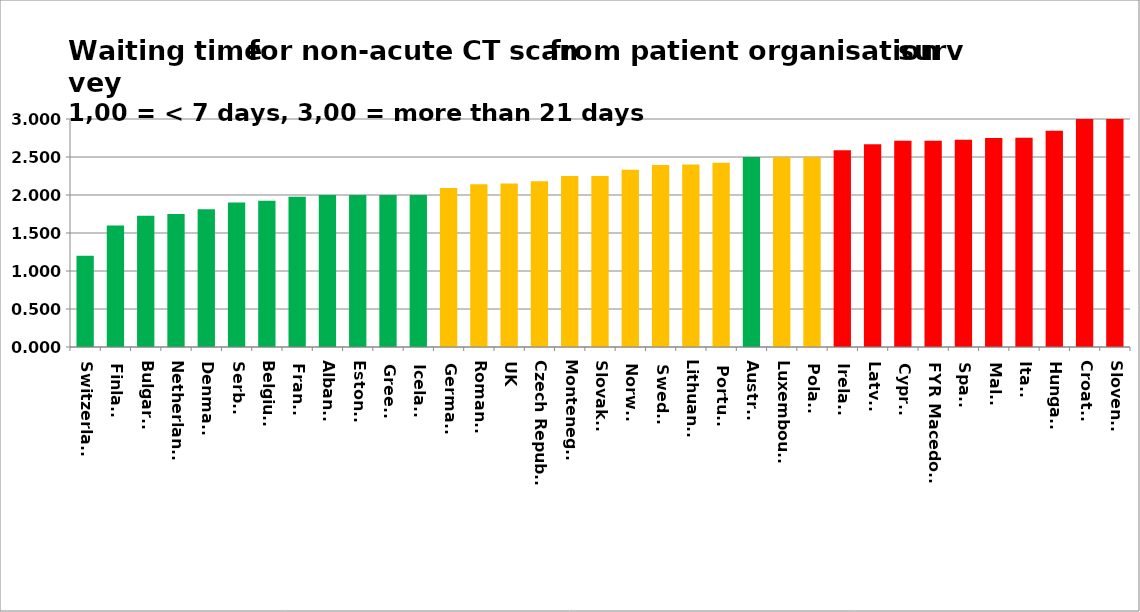
| Category | Series 0 |
|---|---|
| Switzerland | 1.2 |
| Finland | 1.6 |
| Bulgaria | 1.727 |
| Netherlands | 1.75 |
| Denmark | 1.812 |
| Serbia | 1.9 |
| Belgium | 1.926 |
| France | 1.976 |
| Albania | 2 |
| Estonia | 2 |
| Greece | 2 |
| Iceland | 2 |
| Germany | 2.093 |
| Romania | 2.143 |
| UK | 2.15 |
| Czech Republic | 2.182 |
| Montenegro | 2.25 |
| Slovakia | 2.25 |
| Norway | 2.333 |
| Sweden | 2.394 |
| Lithuania | 2.4 |
| Portugal | 2.423 |
| Austria | 2.5 |
| Luxembourg | 2.5 |
| Poland | 2.5 |
| Ireland | 2.588 |
| Latvia | 2.667 |
| Cyprus | 2.714 |
| FYR Macedonia | 2.714 |
| Spain | 2.725 |
| Malta | 2.75 |
| Italy | 2.755 |
| Hungary | 2.846 |
| Croatia | 3 |
| Slovenia | 3 |